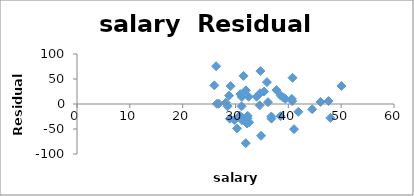
| Category | Series 0 |
|---|---|
| 31.144 | -4.577 |
| 47.951 | -27.854 |
| 32.175 | -39.03 |
| 28.934 | -29.316 |
| 41.078 | -50.425 |
| 34.571 | -2.697 |
| 50.045 | 36.056 |
| 39.076 | 12.85 |
| 32.588 | -36.578 |
| 32.291 | -23.692 |
| 38.518 | -24.499 |
| 29.783 | -32.159 |
| 39.431 | 10.247 |
| 36.785 | -24.942 |
| 31.511 | 56.287 |
| 34.652 | 21.553 |
| 32.257 | -28.668 |
| 26.461 | 0.412 |
| 31.972 | 27.339 |
| 40.661 | 10.279 |
| 40.795 | 52.446 |
| 41.895 | -15.682 |
| 35.948 | 43.727 |
| 26.818 | 0.74 |
| 31.189 | 14.103 |
| 28.785 | 16.689 |
| 30.922 | 19.686 |
| 34.836 | -63.496 |
| 34.72 | 65.905 |
| 46.087 | 4.12 |
| 28.493 | -4.461 |
| 47.612 | 5.91 |
| 30.793 | -23.32 |
| 26.327 | 75.59 |
| 36.802 | -29.233 |
| 28.172 | 2.682 |
| 38.555 | 16.748 |
| 44.51 | -10.441 |
| 40.729 | 5.803 |
| 30.279 | -48.756 |
| 25.994 | 37.316 |
| 32.477 | 14.631 |
| 31.223 | -32.38 |
| 29.082 | 35.804 |
| 35.406 | 24.852 |
| 33.987 | 14.61 |
| 36.151 | 3.654 |
| 31.944 | -78.313 |
| 37.746 | 27.807 |
| 31.285 | -27.327 |